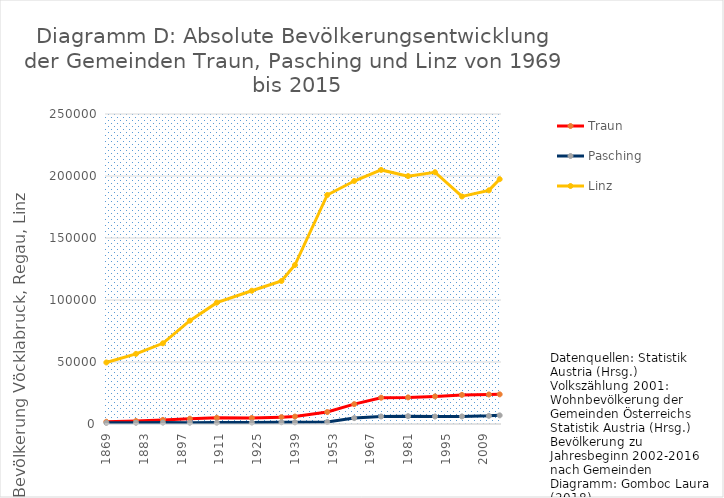
| Category | Traun | Pasching | Linz |
|---|---|---|---|
| 1869.0 | 1781 | 942 | 49635 |
| 1880.0 | 2378 | 1023 | 56569 |
| 1890.0 | 3308 | 1118 | 65090 |
| 1900.0 | 4271 | 1082 | 83356 |
| 1910.0 | 5026 | 1110 | 97852 |
| 1923.0 | 4830 | 1203 | 107463 |
| 1934.0 | 5512 | 1408 | 115338 |
| 1939.0 | 5985 | 1372 | 128177 |
| 1951.0 | 9655 | 1700 | 184685 |
| 1961.0 | 16026 | 4748 | 195978 |
| 1971.0 | 21215 | 6081 | 204889 |
| 1981.0 | 21464 | 6325 | 199910 |
| 1991.0 | 22260 | 6052 | 203044 |
| 2001.0 | 23470 | 6123 | 183504 |
| 2011.0 | 23797 | 6584 | 188431 |
| 2015.0 | 23921 | 6971 | 197427 |